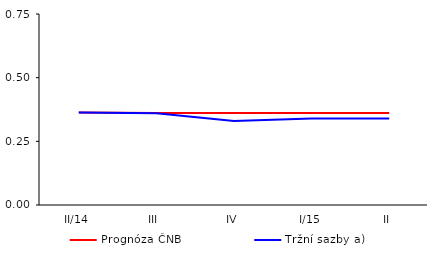
| Category | Prognóza ČNB | Tržní sazby a) |
|---|---|---|
| II/14 | 0.363 | 0.363 |
| III | 0.361 | 0.36 |
| IV | 0.361 | 0.33 |
| I/15 | 0.361 | 0.34 |
| II | 0.361 | 0.34 |